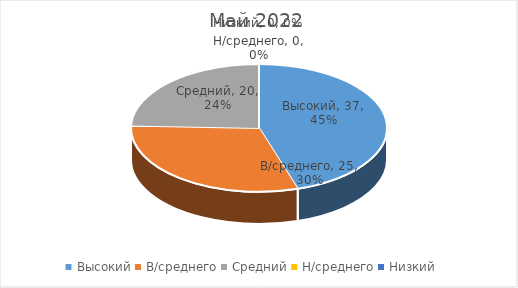
| Category | Май 2022 |
|---|---|
| Высокий | 37 |
| В/среднего | 25 |
| Средний | 20 |
| Н/среднего | 0 |
| Низкий | 0 |